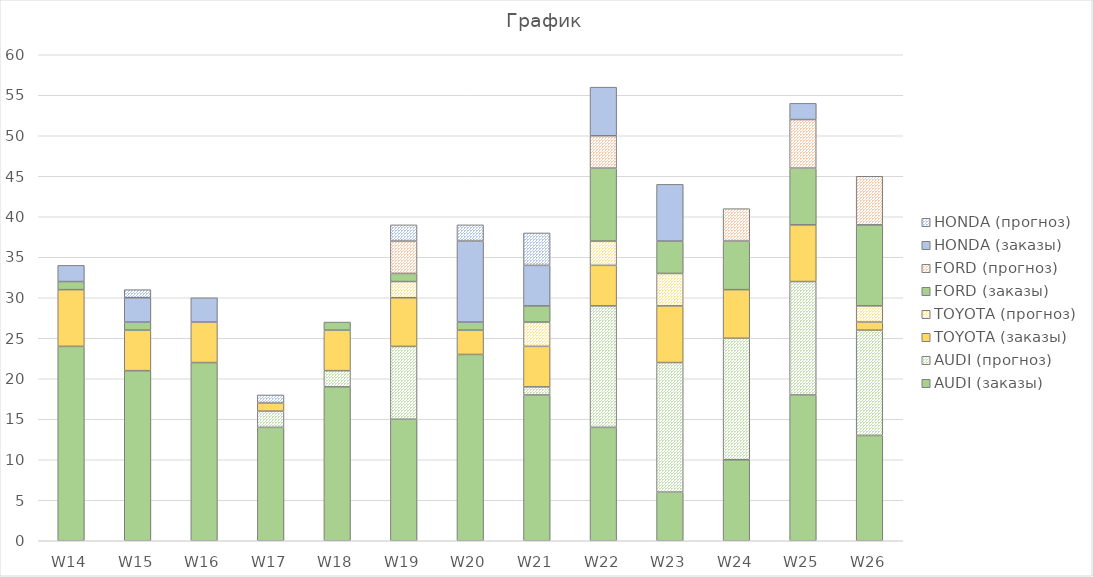
| Category | AUDI (заказы) | AUDI (прогноз) | TOYOTA (заказы) | TOYOTA (прогноз) | FORD (заказы) | FORD (прогноз) | HONDA (заказы) | HONDA (прогноз) |
|---|---|---|---|---|---|---|---|---|
| W14 | 24 | 0 | 7 | 0 | 1 | 0 | 2 | 0 |
| W15 | 21 | 0 | 5 | 0 | 1 | 0 | 3 | 1 |
| W16 | 22 | 0 | 5 | 0 | 0 | 0 | 3 | 0 |
| W17 | 14 | 2 | 1 | 0 | 0 | 0 | 0 | 1 |
| W18 | 19 | 2 | 5 | 0 | 1 | 0 | 0 | 0 |
| W19 | 15 | 9 | 6 | 2 | 1 | 4 | 0 | 2 |
| W20 | 23 | 0 | 3 | 0 | 1 | 0 | 10 | 2 |
| W21 | 18 | 1 | 5 | 3 | 2 | 0 | 5 | 4 |
| W22 | 14 | 15 | 5 | 3 | 9 | 4 | 6 | 0 |
| W23 | 6 | 16 | 7 | 4 | 4 | 0 | 7 | 0 |
| W24 | 10 | 15 | 6 | 0 | 6 | 4 | 0 | 0 |
| W25 | 18 | 14 | 7 | 0 | 7 | 6 | 2 | 0 |
| W26 | 13 | 13 | 1 | 2 | 10 | 6 | 0 | 0 |